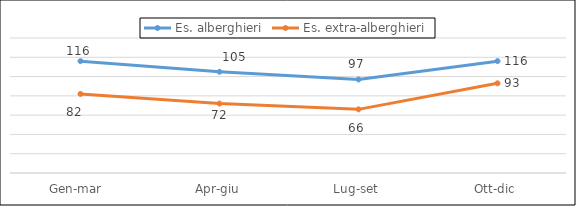
| Category | Es. alberghieri | Es. extra-alberghieri |
|---|---|---|
| Gen-mar  | 116 | 82 |
| Apr-giu | 105 | 72 |
| Lug-set | 97 | 66 |
| Ott-dic | 116 | 93 |